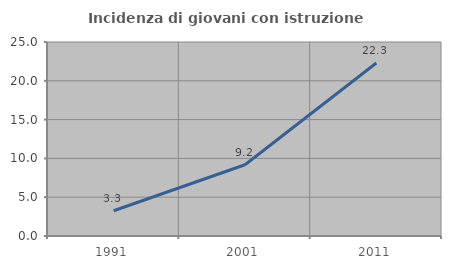
| Category | Incidenza di giovani con istruzione universitaria |
|---|---|
| 1991.0 | 3.253 |
| 2001.0 | 9.182 |
| 2011.0 | 22.296 |